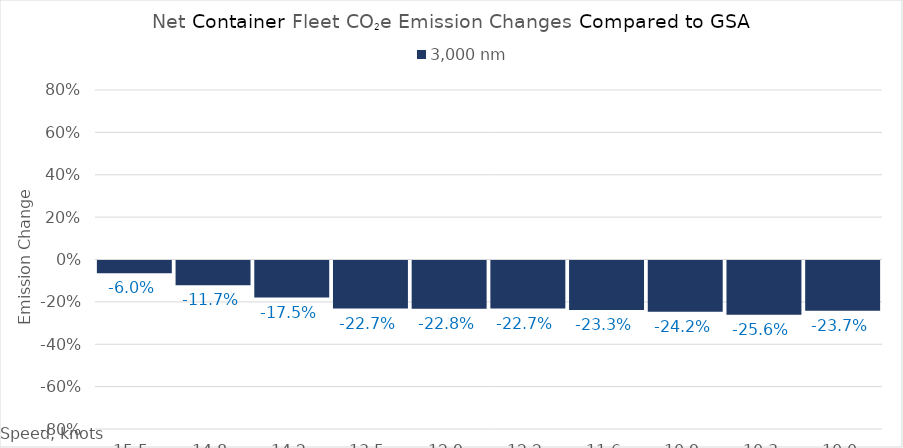
| Category | 3,000 |
|---|---|
| 15.450000000000001 | -0.06 |
| 14.8 | -0.117 |
| 14.15 | -0.175 |
| 13.5 | -0.227 |
| 12.85 | -0.228 |
| 12.2 | -0.227 |
| 11.549999999999999 | -0.233 |
| 10.899999999999999 | -0.242 |
| 10.249999999999998 | -0.256 |
| 10.0 | -0.237 |